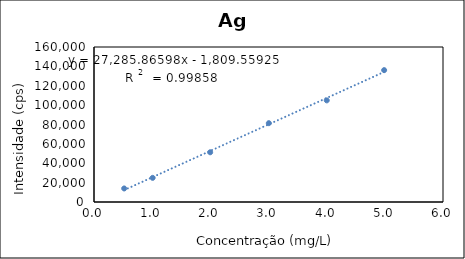
| Category | Series 0 |
|---|---|
| 0.5187939372496604 | 13981.786 |
| 1.008433398649137 | 24924.486 |
| 1.9971941770603752 | 51323.786 |
| 3.00545939031019 | 81364.686 |
| 4.0013411190297115 | 104897.586 |
| 4.988104790380956 | 136108.586 |